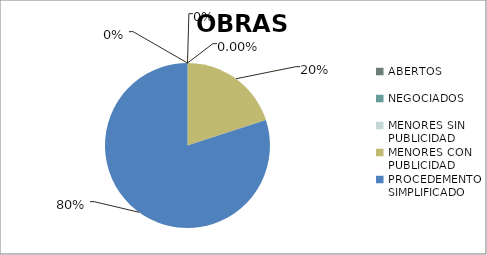
| Category | Series 0 |
|---|---|
| ABERTOS  | 0 |
| NEGOCIADOS  | 0 |
| MENORES SIN PUBLICIDAD | 0 |
| MENORES CON PUBLICIDAD | 0.2 |
| PROCEDEMENTO SIMPLIFICADO | 0.8 |